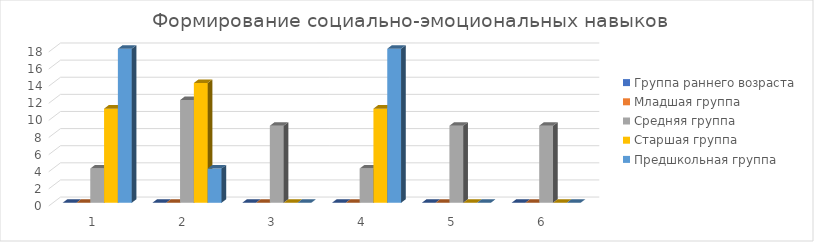
| Category | Группа раннего возраста | Младшая группа | Средняя группа | Старшая группа | Предшкольная группа |
|---|---|---|---|---|---|
| 0 | 0 | 0 | 4 | 11 | 18 |
| 1 | 0 | 0 | 12 | 14 | 4 |
| 2 | 0 | 0 | 9 | 0 | 0 |
| 3 | 0 | 0 | 4 | 11 | 18 |
| 4 | 0 | 0 | 9 | 0 | 0 |
| 5 | 0 | 0 | 9 | 0 | 0 |